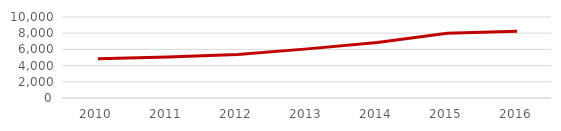
| Category | Deuda Total del Estado por Habitante  |
|---|---|
| 2010.0 | 4833.238 |
| 2011.0 | 5069.533 |
| 2012.0 | 5379.984 |
| 2013.0 | 6064.816 |
| 2014.0 | 6848.608 |
| 2015.0 | 7992.267 |
| 2016.0 | 8230.156 |